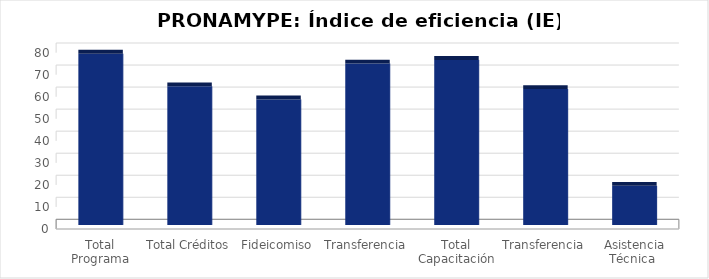
| Category | Índice de eficiencia (IE)  |
|---|---|
| Total Programa | 77.711 |
| Total Créditos | 62.889 |
| Fideicomiso | 56.948 |
| Transferencia | 73.24 |
| Total Capacitación | 74.898 |
| Transferencia | 61.66 |
| Asistencia Técnica  | 17.735 |